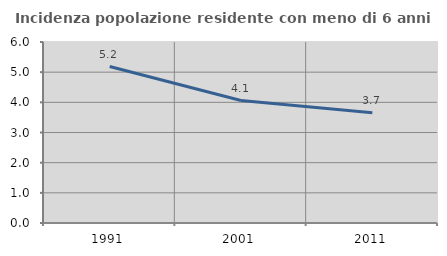
| Category | Incidenza popolazione residente con meno di 6 anni |
|---|---|
| 1991.0 | 5.186 |
| 2001.0 | 4.059 |
| 2011.0 | 3.652 |